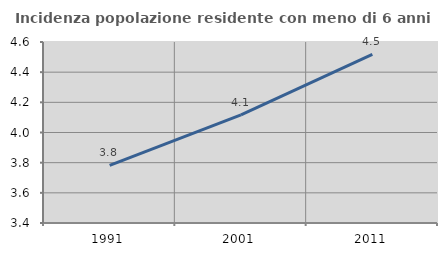
| Category | Incidenza popolazione residente con meno di 6 anni |
|---|---|
| 1991.0 | 3.782 |
| 2001.0 | 4.117 |
| 2011.0 | 4.518 |